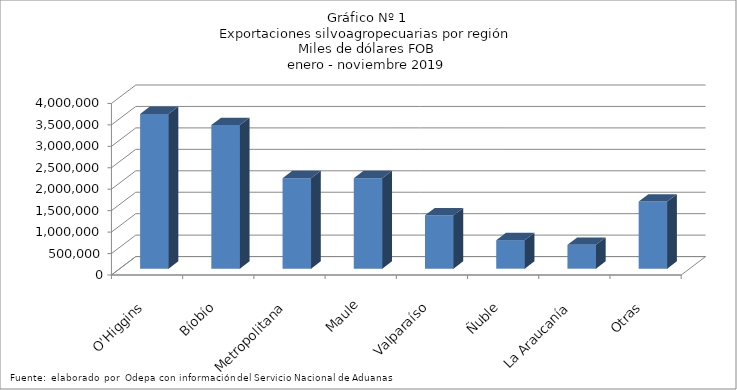
| Category | Series 0 |
|---|---|
| O'Higgins | 3608976.421 |
| Bíobío | 3349266.123 |
| Metropolitana | 2111273.1 |
| Maule | 2111226.856 |
| Valparaíso | 1243379.077 |
| Ñuble | 665005.854 |
| La Araucanía | 555684.394 |
| Otras | 1563645.746 |